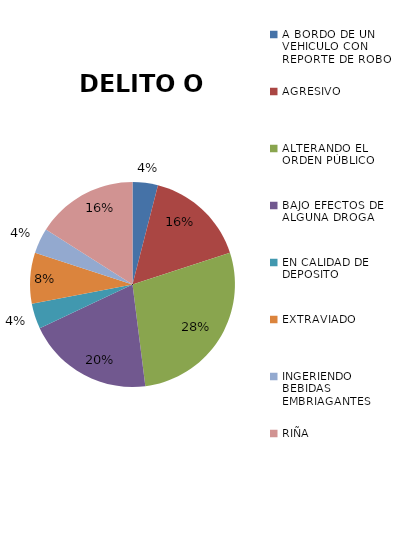
| Category | DELITO O FALTA |
|---|---|
| A BORDO DE UN VEHICULO CON REPORTE DE ROBO | 1 |
| AGRESIVO | 4 |
| ALTERANDO EL ORDEN PÚBLICO | 7 |
| BAJO EFECTOS DE ALGUNA DROGA | 5 |
| EN CALIDAD DE DEPOSITO | 1 |
| EXTRAVIADO | 2 |
| INGERIENDO BEBIDAS EMBRIAGANTES | 1 |
| RIÑA | 4 |